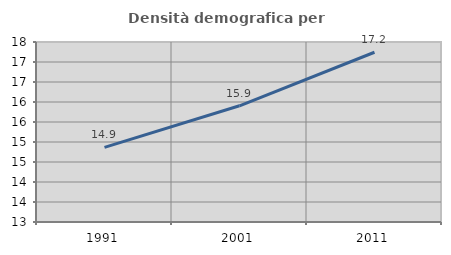
| Category | Densità demografica |
|---|---|
| 1991.0 | 14.866 |
| 2001.0 | 15.905 |
| 2011.0 | 17.244 |